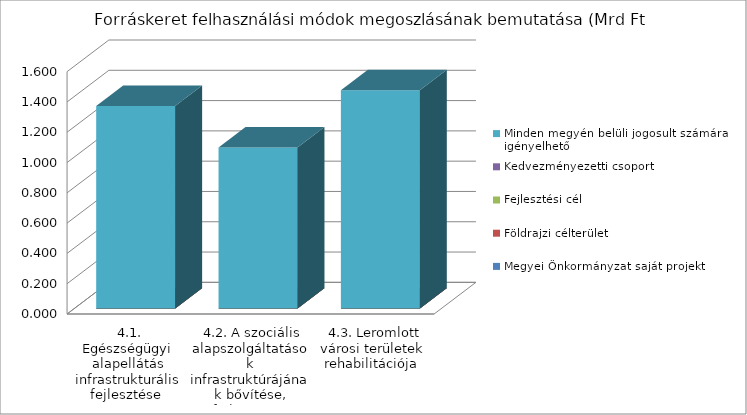
| Category | Megyei Önkormányzat saját projekt | Földrajzi célterület  | Fejlesztési cél  | Kedvezményezetti csoport | Minden megyén belüli jogosult számára igényelhető |
|---|---|---|---|---|---|
| 4.1. Egészségügyi alapellátás infrastrukturális fejlesztése | 0 | 0 | 0 | 0 | 1.336 |
| 4.2. A szociális alapszolgáltatások infrastruktúrájának bővítése, fejlesztése | 0 | 0 | 0 | 0 | 1.062 |
| 4.3. Leromlott városi területek rehabilitációja | 0 | 0 | 0 | 0 | 1.44 |